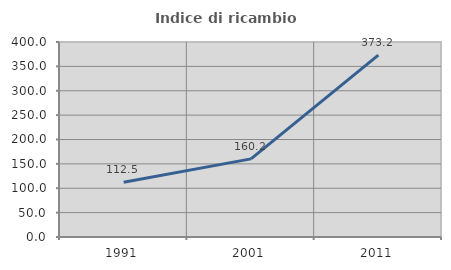
| Category | Indice di ricambio occupazionale  |
|---|---|
| 1991.0 | 112.5 |
| 2001.0 | 160.227 |
| 2011.0 | 373.239 |